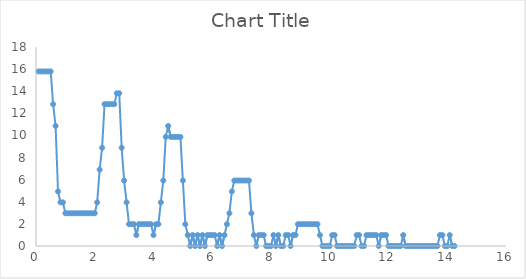
| Category | Series 0 |
|---|---|
| 0.08333333333333333 | 15.79 |
| 0.16666666666666666 | 15.79 |
| 0.25 | 15.79 |
| 0.3333333333333333 | 15.79 |
| 0.4166666666666667 | 15.79 |
| 0.5 | 15.79 |
| 0.5833333333333334 | 12.829 |
| 0.6666666666666666 | 10.855 |
| 0.75 | 4.934 |
| 0.8333333333333334 | 3.947 |
| 0.9166666666666666 | 3.947 |
| 1.0 | 2.961 |
| 1.0833333333333333 | 2.961 |
| 1.1666666666666667 | 2.961 |
| 1.25 | 2.961 |
| 1.3333333333333333 | 2.961 |
| 1.4166666666666667 | 2.961 |
| 1.5 | 2.961 |
| 1.5833333333333333 | 2.961 |
| 1.6666666666666667 | 2.961 |
| 1.75 | 2.961 |
| 1.8333333333333333 | 2.961 |
| 1.9166666666666667 | 2.961 |
| 2.0 | 2.961 |
| 2.0833333333333335 | 3.947 |
| 2.1666666666666665 | 6.908 |
| 2.25 | 8.882 |
| 2.3333333333333335 | 12.829 |
| 2.4166666666666665 | 12.829 |
| 2.5 | 12.829 |
| 2.5833333333333335 | 12.829 |
| 2.6666666666666665 | 12.829 |
| 2.75 | 13.816 |
| 2.8333333333333335 | 13.816 |
| 2.9166666666666665 | 8.882 |
| 3.0 | 5.921 |
| 3.0833333333333335 | 3.947 |
| 3.1666666666666665 | 1.974 |
| 3.25 | 1.974 |
| 3.3333333333333335 | 1.974 |
| 3.4166666666666665 | 0.987 |
| 3.5 | 1.974 |
| 3.5833333333333335 | 1.974 |
| 3.6666666666666665 | 1.974 |
| 3.75 | 1.974 |
| 3.8333333333333335 | 1.974 |
| 3.9166666666666665 | 1.974 |
| 4.0 | 0.987 |
| 4.083333333333333 | 1.974 |
| 4.166666666666667 | 1.974 |
| 4.25 | 3.947 |
| 4.333333333333333 | 5.921 |
| 4.416666666666667 | 9.868 |
| 4.5 | 10.855 |
| 4.583333333333333 | 9.868 |
| 4.666666666666667 | 9.868 |
| 4.75 | 9.868 |
| 4.833333333333333 | 9.868 |
| 4.916666666666667 | 9.868 |
| 5.0 | 5.921 |
| 5.083333333333333 | 1.974 |
| 5.166666666666667 | 0.987 |
| 5.25 | 0 |
| 5.333333333333333 | 0.987 |
| 5.416666666666667 | 0 |
| 5.5 | 0.987 |
| 5.583333333333333 | 0 |
| 5.666666666666667 | 0.987 |
| 5.75 | 0 |
| 5.833333333333333 | 0.987 |
| 5.916666666666667 | 0.987 |
| 6.0 | 0.987 |
| 6.083333333333333 | 0.987 |
| 6.166666666666667 | 0 |
| 6.25 | 0.987 |
| 6.333333333333333 | 0 |
| 6.416666666666667 | 0.987 |
| 6.5 | 1.974 |
| 6.583333333333333 | 2.961 |
| 6.666666666666667 | 4.934 |
| 6.75 | 5.921 |
| 6.833333333333333 | 5.921 |
| 6.916666666666667 | 5.921 |
| 7.0 | 5.921 |
| 7.083333333333333 | 5.921 |
| 7.166666666666667 | 5.921 |
| 7.25 | 5.921 |
| 7.333333333333333 | 2.961 |
| 7.416666666666667 | 0.987 |
| 7.5 | 0 |
| 7.583333333333333 | 0.987 |
| 7.666666666666667 | 0.987 |
| 7.75 | 0.987 |
| 7.833333333333333 | 0 |
| 7.916666666666667 | 0 |
| 8.0 | 0 |
| 8.083333333333334 | 0.987 |
| 8.166666666666666 | 0 |
| 8.25 | 0.987 |
| 8.333333333333334 | 0 |
| 8.416666666666666 | 0 |
| 8.5 | 0.987 |
| 8.583333333333334 | 0.987 |
| 8.666666666666666 | 0 |
| 8.75 | 0.987 |
| 8.833333333333334 | 0.987 |
| 8.916666666666666 | 1.974 |
| 9.0 | 1.974 |
| 9.083333333333334 | 1.974 |
| 9.166666666666666 | 1.974 |
| 9.25 | 1.974 |
| 9.333333333333334 | 1.974 |
| 9.416666666666666 | 1.974 |
| 9.5 | 1.974 |
| 9.583333333333334 | 1.974 |
| 9.666666666666666 | 0.987 |
| 9.75 | 0 |
| 9.833333333333334 | 0 |
| 9.916666666666666 | 0 |
| 10.0 | 0 |
| 10.083333333333334 | 0.987 |
| 10.166666666666666 | 0.987 |
| 10.25 | 0 |
| 10.333333333333334 | 0 |
| 10.416666666666666 | 0 |
| 10.5 | 0 |
| 10.583333333333334 | 0 |
| 10.666666666666666 | 0 |
| 10.75 | 0 |
| 10.833333333333334 | 0 |
| 10.916666666666666 | 0.987 |
| 11.0 | 0.987 |
| 11.083333333333334 | 0 |
| 11.166666666666666 | 0 |
| 11.25 | 0.987 |
| 11.333333333333334 | 0.987 |
| 11.416666666666666 | 0.987 |
| 11.5 | 0.987 |
| 11.583333333333334 | 0.987 |
| 11.666666666666666 | 0 |
| 11.75 | 0.987 |
| 11.833333333333334 | 0.987 |
| 11.916666666666666 | 0.987 |
| 12.0 | 0 |
| 12.083333333333334 | 0 |
| 12.166666666666666 | 0 |
| 12.25 | 0 |
| 12.333333333333334 | 0 |
| 12.416666666666666 | 0 |
| 12.5 | 0.987 |
| 12.583333333333334 | 0 |
| 12.666666666666666 | 0 |
| 12.75 | 0 |
| 12.833333333333334 | 0 |
| 12.916666666666666 | 0 |
| 13.0 | 0 |
| 13.083333333333334 | 0 |
| 13.166666666666666 | 0 |
| 13.25 | 0 |
| 13.333333333333334 | 0 |
| 13.416666666666666 | 0 |
| 13.5 | 0 |
| 13.583333333333334 | 0 |
| 13.666666666666666 | 0 |
| 13.75 | 0.987 |
| 13.833333333333334 | 0.987 |
| 13.916666666666666 | 0 |
| 14.0 | 0 |
| 14.083333333333334 | 0.987 |
| 14.166666666666666 | 0 |
| 14.25 | 0 |